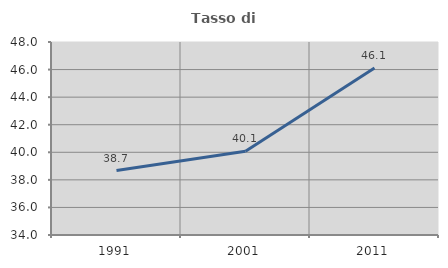
| Category | Tasso di occupazione   |
|---|---|
| 1991.0 | 38.672 |
| 2001.0 | 40.067 |
| 2011.0 | 46.106 |